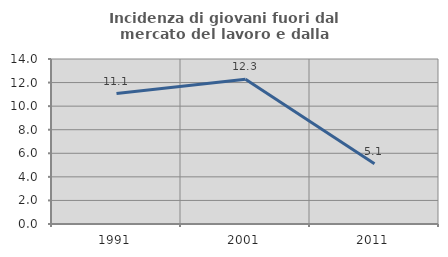
| Category | Incidenza di giovani fuori dal mercato del lavoro e dalla formazione  |
|---|---|
| 1991.0 | 11.067 |
| 2001.0 | 12.273 |
| 2011.0 | 5.102 |